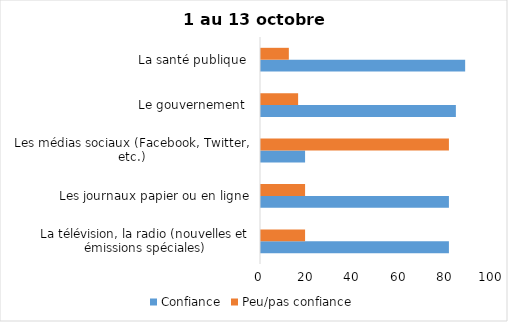
| Category | Confiance | Peu/pas confiance |
|---|---|---|
| La télévision, la radio (nouvelles et émissions spéciales) | 81 | 19 |
| Les journaux papier ou en ligne | 81 | 19 |
| Les médias sociaux (Facebook, Twitter, etc.) | 19 | 81 |
| Le gouvernement  | 84 | 16 |
| La santé publique  | 88 | 12 |